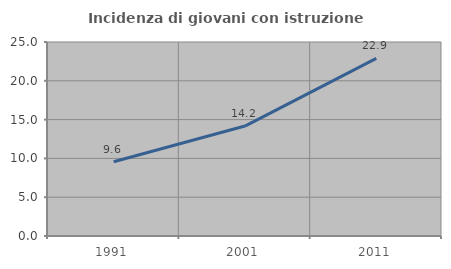
| Category | Incidenza di giovani con istruzione universitaria |
|---|---|
| 1991.0 | 9.571 |
| 2001.0 | 14.169 |
| 2011.0 | 22.887 |